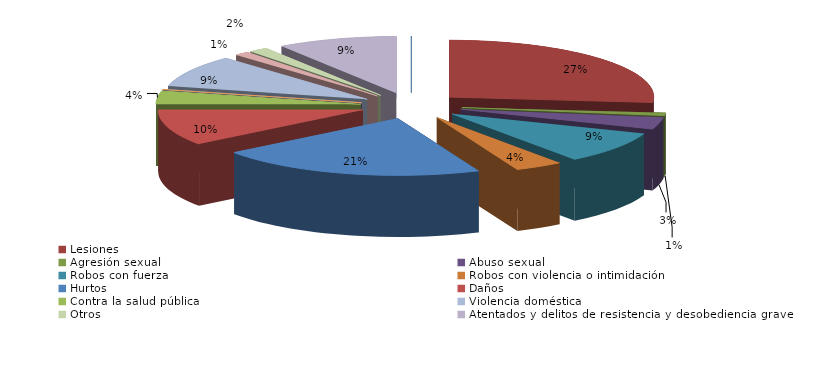
| Category | Series 0 |
|---|---|
| Homicidio/Asesinato dolosos | 0 |
| Lesiones | 70 |
| Agresión sexual | 2 |
| Abuso sexual | 9 |
| Robos con fuerza | 24 |
| Robos con violencia o intimidación | 10 |
| Hurtos | 56 |
| Daños | 27 |
| Contra la salud pública | 10 |
| Conduccción etílica/drogas | 0 |
| Conducción temeraria | 0 |
| Conducción sin permiso | 0 |
| Violencia doméstica | 24 |
| Violencia de género | 3 |
| Otros | 4 |
| Atentados y delitos de resistencia y desobediencia grave | 25 |
| Otros delitos contra el orden público | 0 |